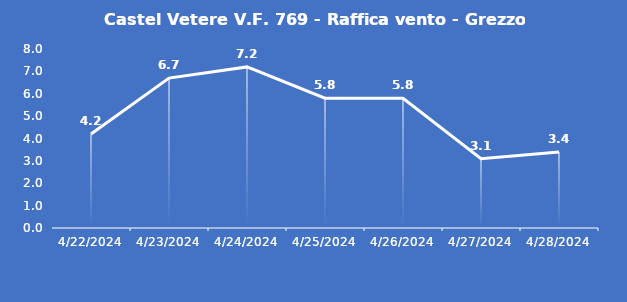
| Category | Castel Vetere V.F. 769 - Raffica vento - Grezzo (m/s) |
|---|---|
| 4/22/24 | 4.2 |
| 4/23/24 | 6.7 |
| 4/24/24 | 7.2 |
| 4/25/24 | 5.8 |
| 4/26/24 | 5.8 |
| 4/27/24 | 3.1 |
| 4/28/24 | 3.4 |